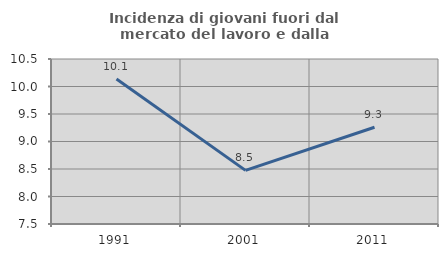
| Category | Incidenza di giovani fuori dal mercato del lavoro e dalla formazione  |
|---|---|
| 1991.0 | 10.135 |
| 2001.0 | 8.475 |
| 2011.0 | 9.259 |